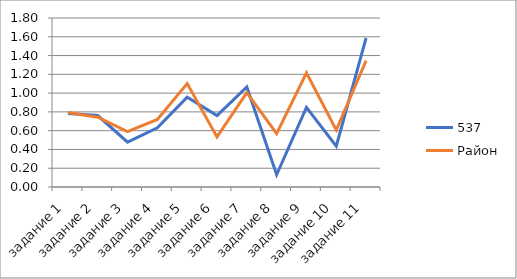
| Category | 537 | Район |
|---|---|---|
| задание 1 | 0.783 | 0.794 |
| задание 2 | 0.761 | 0.743 |
| задание 3 | 0.478 | 0.59 |
| задание 4 | 0.63 | 0.719 |
| задание 5 | 0.957 | 1.101 |
| задание 6 | 0.761 | 0.533 |
| задание 7 | 1.065 | 1.005 |
| задание 8 | 0.13 | 0.569 |
| задание 9 | 0.848 | 1.217 |
| задание 10 | 0.435 | 0.606 |
| задание 11 | 1.587 | 1.346 |